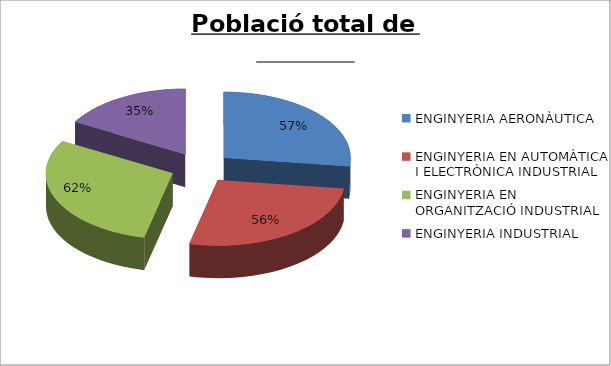
| Category | Series 0 |
|---|---|
| ENGINYERIA AERONÀUTICA | 0.568 |
| ENGINYERIA EN AUTOMÀTICA I ELECTRÒNICA INDUSTRIAL | 0.556 |
| ENGINYERIA EN ORGANITZACIÓ INDUSTRIAL | 0.62 |
| ENGINYERIA INDUSTRIAL | 0.352 |